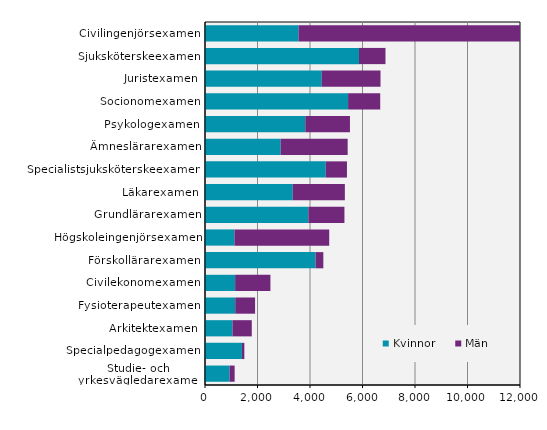
| Category | Kvinnor | Män |
|---|---|---|
| Studie- och yrkesvägledarexamen | 936 | 193 |
| Specialpedagogexamen | 1407 | 92 |
| Arkitektexamen | 1047 | 735 |
| Fysioterapeutexamen | 1152 | 756 |
| Civilekonomexamen | 1148 | 1344 |
| Förskollärarexamen | 4211 | 297 |
| Högskoleingenjörsexamen | 1121 | 3611 |
| Grundlärarexamen | 3938 | 1374 |
| Läkarexamen | 3343 | 1985 |
| Specialistsjuksköterskeexamen | 4601 | 807 |
| Ämneslärarexamen | 2883 | 2552 |
| Psykologexamen | 3821 | 1701 |
| Socionomexamen | 5451 | 1224 |
| Juristexamen | 4448 | 2238 |
| Sjuksköterskeexamen | 5866 | 1009 |
| Civilingenjörsexamen | 3563 | 8566 |